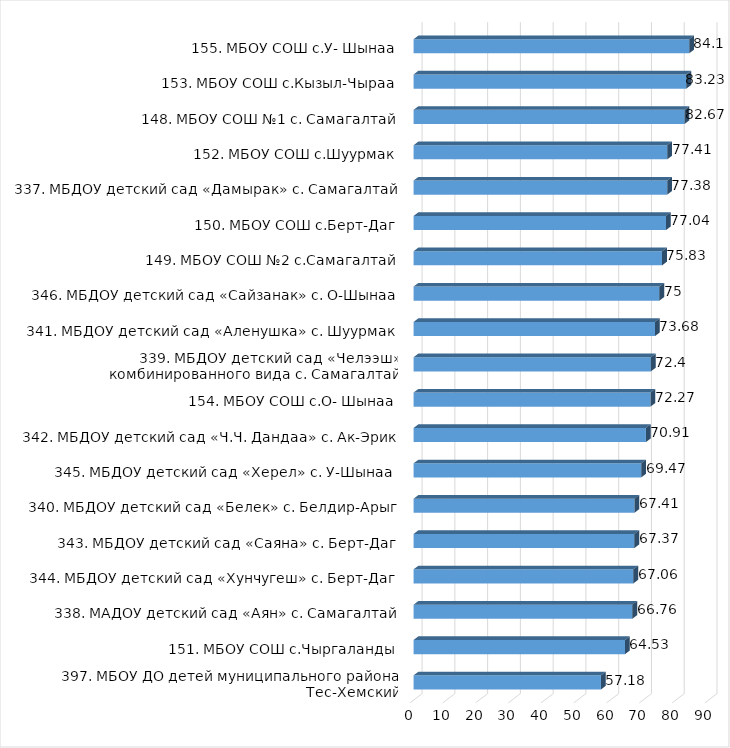
| Category | Series 0 |
|---|---|
| 397. МБОУ ДО детей муниципального района Тес-Хемский | 57.18 |
| 151. МБОУ СОШ с.Чыргаланды | 64.53 |
| 338. МАДОУ детский сад «Аян» с. Самагалтай | 66.76 |
| 344. МБДОУ детский сад «Хунчугеш» с. Берт-Даг | 67.06 |
| 343. МБДОУ детский сад «Саяна» с. Берт-Даг | 67.37 |
| 340. МБДОУ детский сад «Белек» с. Белдир-Арыг | 67.41 |
| 345. МБДОУ детский сад «Херел» с. У-Шынаа  | 69.47 |
| 342. МБДОУ детский сад «Ч.Ч. Дандаа» с. Ак-Эрик | 70.91 |
| 154. МБОУ СОШ с.О- Шынаа | 72.27 |
| 339. МБДОУ детский сад «Челээш» комбинированного вида с. Самагалтай | 72.4 |
| 341. МБДОУ детский сад «Аленушка» с. Шуурмак | 73.68 |
| 346. МБДОУ детский сад «Сайзанак» с. О-Шынаа | 75 |
| 149. МБОУ СОШ №2 с.Самагалтай | 75.83 |
| 150. МБОУ СОШ с.Берт-Даг | 77.04 |
| 337. МБДОУ детский сад «Дамырак» с. Самагалтай | 77.38 |
| 152. МБОУ СОШ с.Шуурмак | 77.41 |
| 148. МБОУ СОШ №1 с. Самагалтай | 82.67 |
| 153. МБОУ СОШ с.Кызыл-Чыраа | 83.23 |
| 155. МБОУ СОШ с.У- Шынаа | 84.1 |